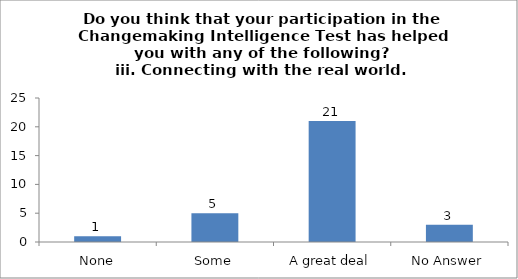
| Category | Do you think that your participation in the Changemaking Intelligence Test has helped you with any of the following?
iii. Connecting with the real world. |
|---|---|
| None | 1 |
| Some | 5 |
| A great deal | 21 |
| No Answer | 3 |